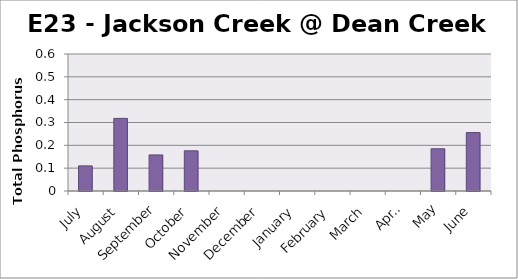
| Category | Phosphorus (mg/L) |
|---|---|
| July | 0.11 |
| August | 0.318 |
| September | 0.158 |
| October | 0.176 |
| November | 0 |
| December | 0 |
| January | 0 |
| February | 0 |
| March | 0 |
| April | 0 |
| May | 0.185 |
| June | 0.256 |